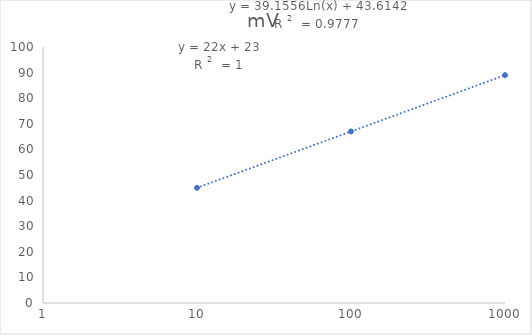
| Category | mV |
|---|---|
| 10.0 | 45 |
| 100.0 | 67 |
| 1000.0 | 89 |